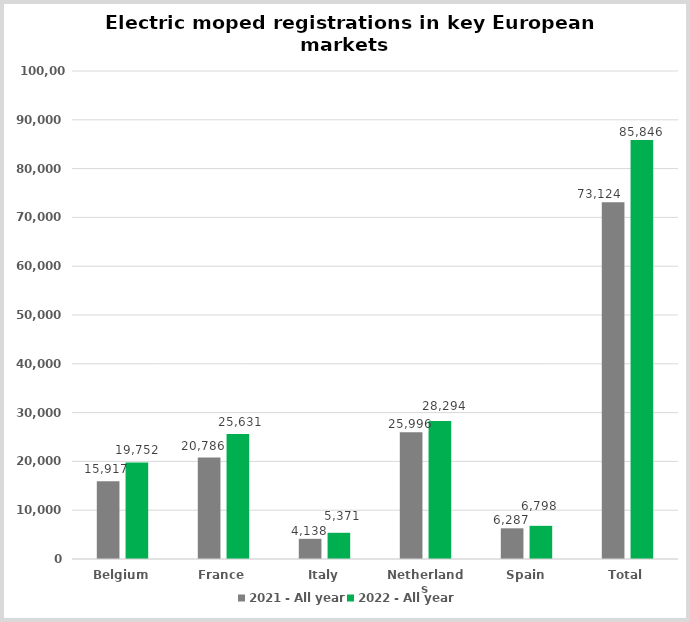
| Category | 2021 - All year | 2022 - All year |
|---|---|---|
| Belgium | 15917 | 19752 |
| France | 20786 | 25631 |
| Italy | 4138 | 5371 |
| Netherlands | 25996 | 28294 |
| Spain | 6287 | 6798 |
| Total | 73124 | 85846 |